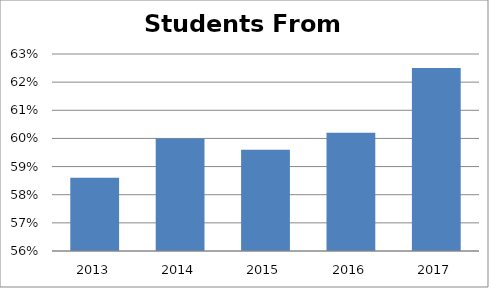
| Category | Series 0 |
|---|---|
| 2013.0 | 0.586 |
| 2014.0 | 0.6 |
| 2015.0 | 0.596 |
| 2016.0 | 0.602 |
| 2017.0 | 0.625 |